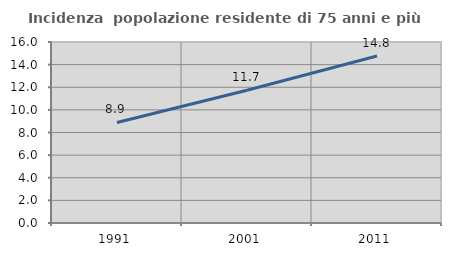
| Category | Incidenza  popolazione residente di 75 anni e più |
|---|---|
| 1991.0 | 8.888 |
| 2001.0 | 11.73 |
| 2011.0 | 14.768 |